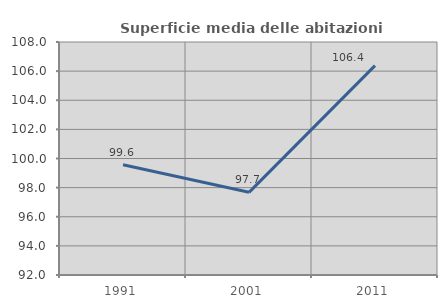
| Category | Superficie media delle abitazioni occupate |
|---|---|
| 1991.0 | 99.569 |
| 2001.0 | 97.677 |
| 2011.0 | 106.374 |